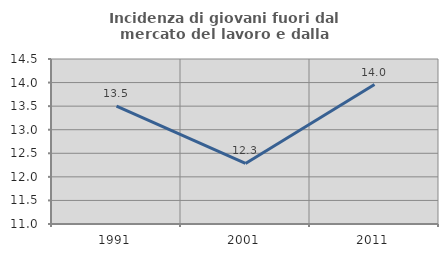
| Category | Incidenza di giovani fuori dal mercato del lavoro e dalla formazione  |
|---|---|
| 1991.0 | 13.501 |
| 2001.0 | 12.284 |
| 2011.0 | 13.959 |